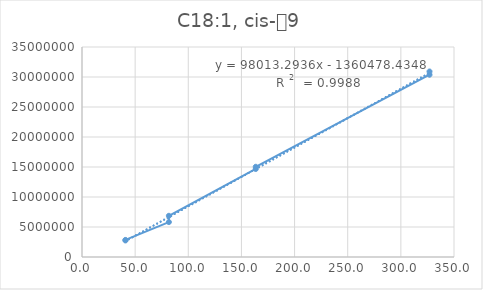
| Category | Series 0 |
|---|---|
| 40.86992015527446 | 2842641 |
| 40.86992015527446 | 2759082 |
| 81.73984031054891 | 5819974 |
| 81.73984031054891 | 6865322 |
| 163.47968062109783 | 14669772 |
| 163.47968062109783 | 15036623 |
| 326.95936124219565 | 30379904 |
| 326.95936124219565 | 30916719 |